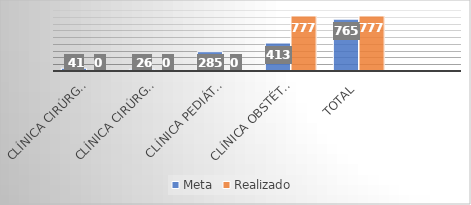
| Category | Meta | Realizado |
|---|---|---|
| Clínica Cirúrgica Pediátrica | 41 | 0 |
| Clínica Cirúrgica CERFIS | 26 | 0 |
| Clínica Pediátrica | 285 | 0 |
| Clínica Obstétrica | 413 | 812 |
| Total | 765 | 812 |